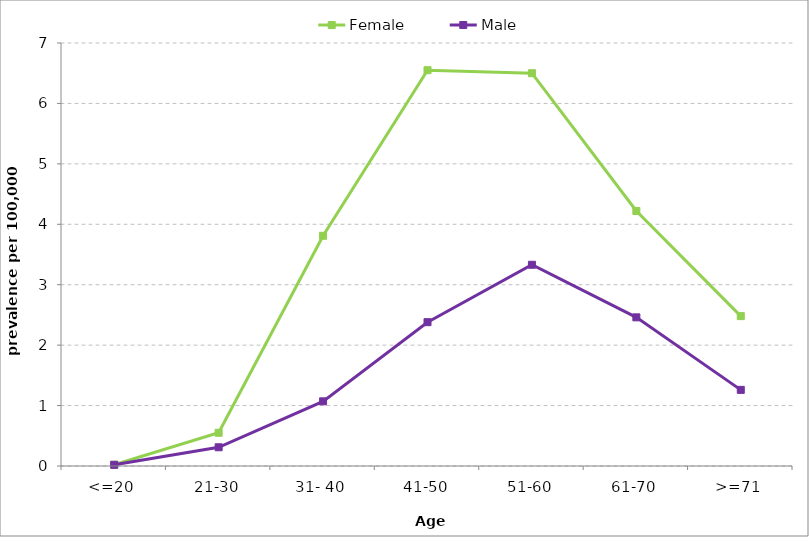
| Category | Female | Male |
|---|---|---|
| <=20 | 0.02 | 0.02 |
| 21-30 | 0.55 | 0.31 |
| 31- 40 | 3.81 | 1.07 |
| 41-50 | 6.55 | 2.38 |
| 51-60 | 6.5 | 3.33 |
| 61-70 | 4.22 | 2.46 |
| >=71 | 2.48 | 1.26 |